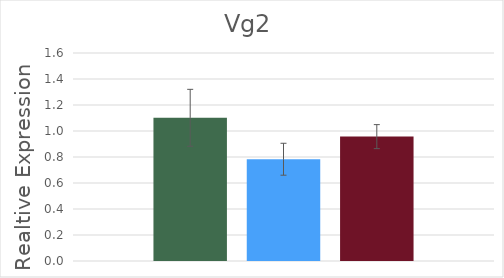
| Category | Control | Acetone | Hydroprene |
|---|---|---|---|
| Vg2 | 1.101 | 0.783 | 0.957 |